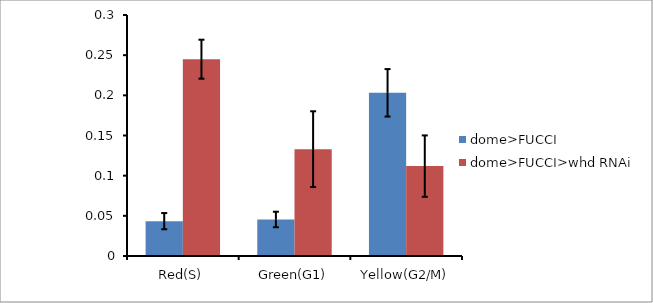
| Category | dome>FUCCI | dome>FUCCI>whd RNAi |
|---|---|---|
| Red(S) | 0.043 | 0.245 |
| Green(G1) | 0.045 | 0.133 |
| Yellow(G2/M) | 0.203 | 0.112 |